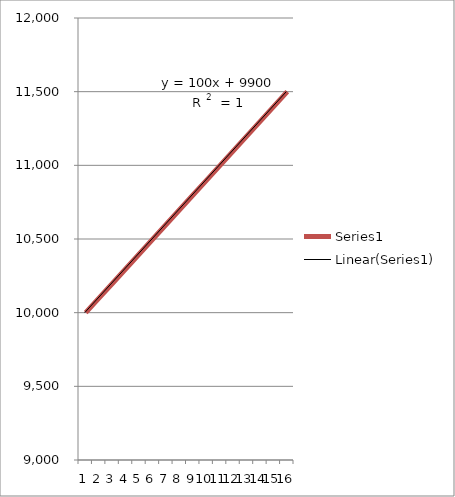
| Category | Series 1 |
|---|---|
| 0 | 10000 |
| 1 | 10100 |
| 2 | 10200 |
| 3 | 10300 |
| 4 | 10400 |
| 5 | 10500 |
| 6 | 10600 |
| 7 | 10700 |
| 8 | 10800 |
| 9 | 10900 |
| 10 | 11000 |
| 11 | 11100 |
| 12 | 11200 |
| 13 | 11300 |
| 14 | 11400 |
| 15 | 11500 |